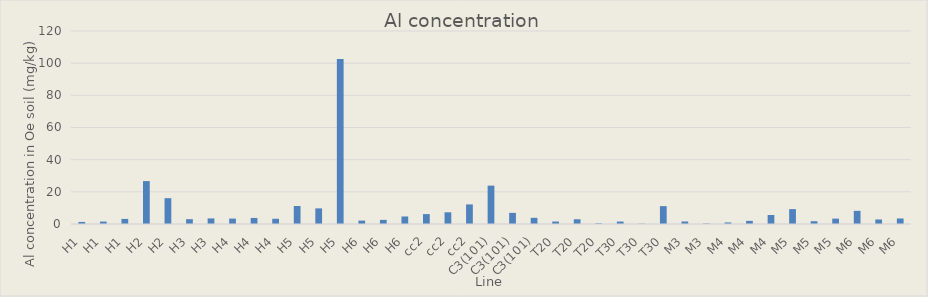
| Category | Series 0 |
|---|---|
| H1 | 1.281 |
| H1 | 1.515 |
| H1 | 3.168 |
| H2 | 26.674 |
| H2 | 16.065 |
| H3 | 3.003 |
| H3 | 3.471 |
| H4 | 3.355 |
| H4 | 3.764 |
| H4 | 3.24 |
| H5 | 11.175 |
| H5 | 9.721 |
| H5 | 102.546 |
| H6 | 2.123 |
| H6 | 2.564 |
| H6 | 4.685 |
| cc2 | 6.165 |
| cc2 | 7.273 |
| cc2 | 12.167 |
| C3(101) | 23.857 |
| C3(101) | 6.923 |
| C3(101) | 3.842 |
| T20 | 1.536 |
| T20 | 2.941 |
| T20 | 0.43 |
| T30 | 1.532 |
| T30 | 0.197 |
| T30 | 11.118 |
| M3 | 1.569 |
| M3 | 0.303 |
| M4 | 0.957 |
| M4 | 1.946 |
| M4 | 5.592 |
| M5 | 9.261 |
| M5 | 1.741 |
| M5 | 3.339 |
| M6 | 8.189 |
| M6 | 2.805 |
| M6 | 3.433 |